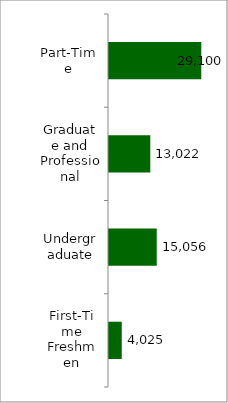
| Category | 50 states and D.C. |
|---|---|
| First-Time Freshmen | 4025 |
| Undergraduate | 15056 |
| Graduate and Professional | 13022 |
| Part-Time | 29100 |